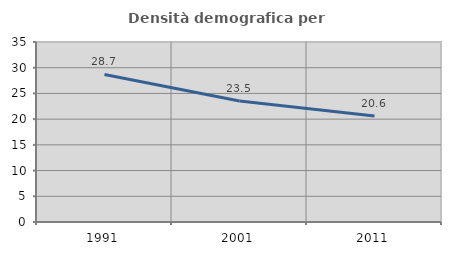
| Category | Densità demografica |
|---|---|
| 1991.0 | 28.692 |
| 2001.0 | 23.534 |
| 2011.0 | 20.629 |